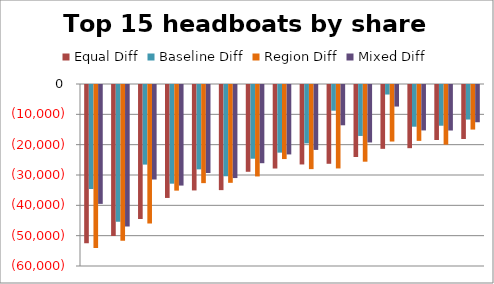
| Category | Equal Diff | Baseline Diff | Region Diff | Mixed Diff |
|---|---|---|---|---|
| 0 | -52183.43 | -34279.43 | -53720.43 | -39194.43 |
| 1 | -49789.622 | -45085.622 | -51326.622 | -46664.622 |
| 2 | -44146.233 | -26242.233 | -45683.233 | -31157.233 |
| 3 | -37234.345 | -32530.345 | -34825.345 | -33156.345 |
| 4 | -34761.361 | -27813.361 | -32352.361 | -29006.361 |
| 5 | -34658.601 | -30086.601 | -32249.601 | -30679.601 |
| 6 | -28609.225 | -24301.225 | -30146.225 | -25780.225 |
| 7 | -27532.77 | -22300.77 | -24415.77 | -22888.77 |
| 8 | -26196.887 | -19248.887 | -27733.887 | -21394.887 |
| 9 | -25972.836 | -8464.836 | -27509.836 | -13279.836 |
| 10 | -23745.803 | -16797.803 | -25282.803 | -18943.803 |
| 11 | -21047.084 | -3143.084 | -18638.084 | -7104.084 |
| 12 | -20829.771 | -13749.771 | -18420.771 | -14975.771 |
| 13 | -18129.367 | -13425.367 | -19666.367 | -15004.367 |
| 14 | -17809.295 | -11389.295 | -14692.295 | -12277.295 |